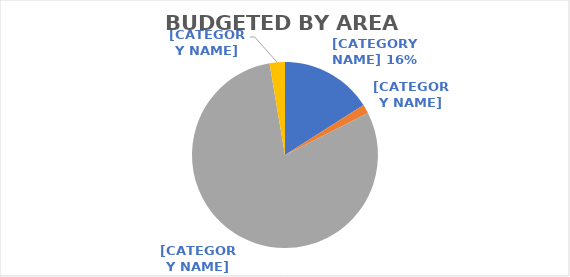
| Category | Series 0 | Series 1 |
|---|---|---|
| Urban - Clark | 87878880.99 | 0.16 |
| Rural | 8520818.24 | 0.016 |
| Statewide | 438617561.71 | 0.798 |
| Urban - Washoe | 14635622.93 | 0.027 |